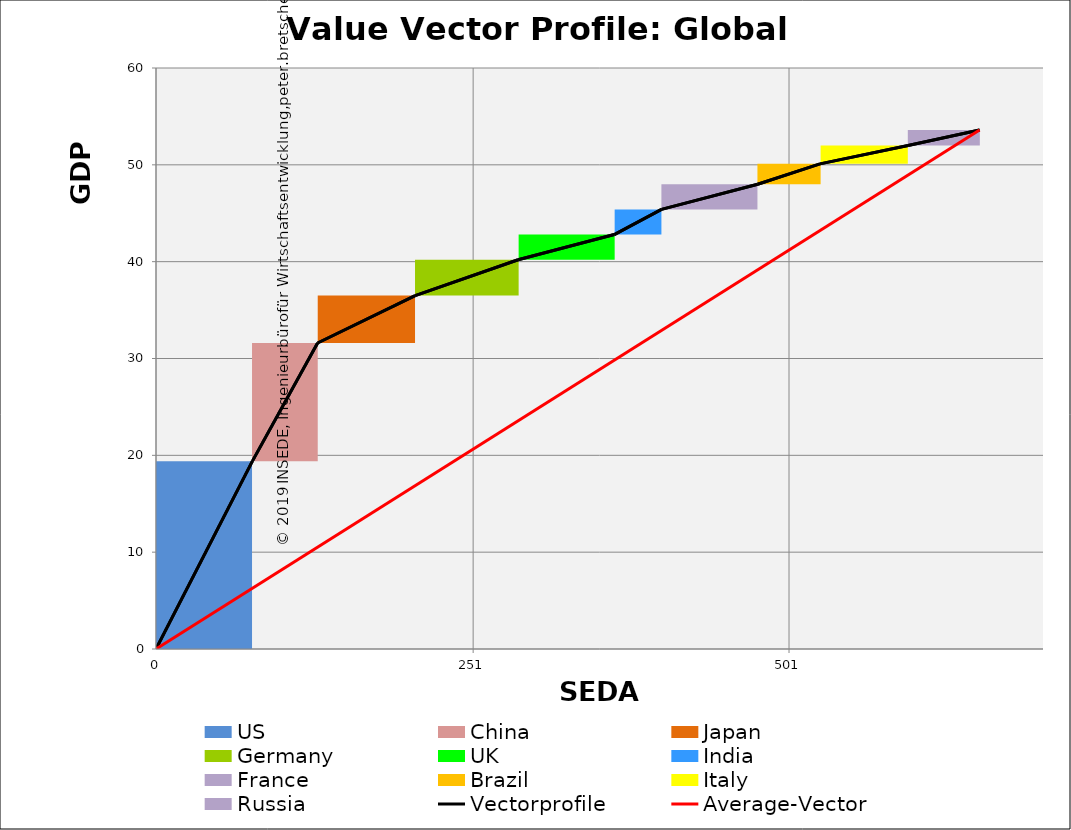
| Category | transparent | US | China | Japan | Germany | UK | India | France | Brazil | Italy | Russia | Border right & top |
|---|---|---|---|---|---|---|---|---|---|---|---|---|
| 0.0 | 0 | 19.4 | 0 | 0 | 0 | 0 | 0 | 0 | 0 | 0 | 0 | 0 |
| 76.3 | 0 | 19.4 | 0 | 0 | 0 | 0 | 0 | 0 | 0 | 0 | 0 | 0 |
| 76.3 | 19.4 | 0 | 12.2 | 0 | 0 | 0 | 0 | 0 | 0 | 0 | 0 | 0 |
| 127.9 | 19.4 | 0 | 12.2 | 0 | 0 | 0 | 0 | 0 | 0 | 0 | 0 | 0 |
| 127.9 | 31.6 | 0 | 0 | 4.9 | 0 | 0 | 0 | 0 | 0 | 0 | 0 | 0 |
| 205.10000000000002 | 31.6 | 0 | 0 | 4.9 | 0 | 0 | 0 | 0 | 0 | 0 | 0 | 0 |
| 205.10000000000002 | 36.5 | 0 | 0 | 0 | 3.7 | 0 | 0 | 0 | 0 | 0 | 0 | 0 |
| 286.6 | 36.5 | 0 | 0 | 0 | 3.7 | 0 | 0 | 0 | 0 | 0 | 0 | 0 |
| 286.6 | 40.2 | 0 | 0 | 0 | 0 | 2.6 | 0 | 0 | 0 | 0 | 0 | 0 |
| 362.70000000000005 | 40.2 | 0 | 0 | 0 | 0 | 2.6 | 0 | 0 | 0 | 0 | 0 | 0 |
| 362.70000000000005 | 42.8 | 0 | 0 | 0 | 0 | 0 | 2.6 | 0 | 0 | 0 | 0 | 0 |
| 400.1 | 42.8 | 0 | 0 | 0 | 0 | 0 | 2.6 | 0 | 0 | 0 | 0 | 0 |
| 400.1 | 45.4 | 0 | 0 | 0 | 0 | 0 | 0 | 2.6 | 0 | 0 | 0 | 0 |
| 476.20000000000005 | 45.4 | 0 | 0 | 0 | 0 | 0 | 0 | 2.6 | 0 | 0 | 0 | 0 |
| 476.20000000000005 | 48 | 0 | 0 | 0 | 0 | 0 | 0 | 0 | 2.1 | 0 | 0 | 0 |
| 525.5 | 48 | 0 | 0 | 0 | 0 | 0 | 0 | 0 | 2.1 | 0 | 0 | 0 |
| 525.5 | 50.1 | 0 | 0 | 0 | 0 | 0 | 0 | 0 | 0 | 1.9 | 0 | 0 |
| 595.2 | 50.1 | 0 | 0 | 0 | 0 | 0 | 0 | 0 | 0 | 1.9 | 0 | 0 |
| 595.2 | 52 | 0 | 0 | 0 | 0 | 0 | 0 | 0 | 0 | 0 | 1.6 | 0 |
| 651.8000000000001 | 52 | 0 | 0 | 0 | 0 | 0 | 0 | 0 | 0 | 0 | 1.6 | 0 |
| 651.8000000000001 | 53.6 | 0 | 0 | 0 | 0 | 0 | 0 | 0 | 0 | 0 | 0 | 0 |
| 701.8000000000001 | 53.6 | 0 | 0 | 0 | 0 | 0 | 0 | 0 | 0 | 0 | 0 | 0 |
| 701.8000000000001 | 53.6 | 0 | 0 | 0 | 0 | 0 | 0 | 0 | 0 | 0 | 0 | 0 |